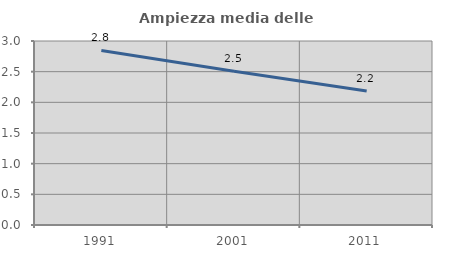
| Category | Ampiezza media delle famiglie |
|---|---|
| 1991.0 | 2.846 |
| 2001.0 | 2.508 |
| 2011.0 | 2.184 |